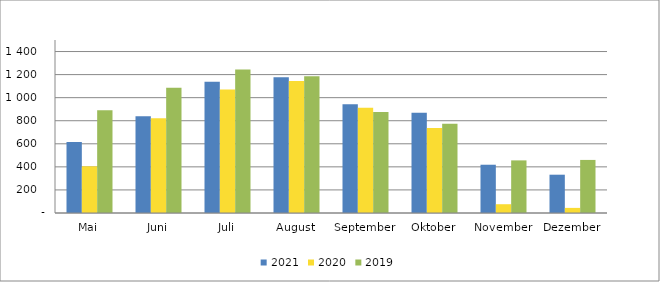
| Category | 2021 | 2020 | 2019 |
|---|---|---|---|
| Mai | 616132 | 404870 | 891354 |
| Juni | 839169 | 820867 | 1086638 |
| Juli | 1137664 | 1070071 | 1244103 |
| August | 1177969 | 1144363 | 1184768 |
| September | 942037 | 913446 | 875331 |
| Oktober | 870056 | 736892 | 773129 |
| November | 418550 | 76148 | 456199 |
| Dezember | 332107 | 44298 | 460123 |